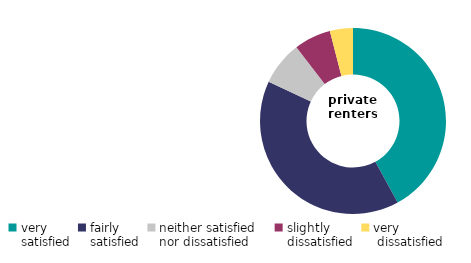
| Category | private renters |
|---|---|
| very 
satisfied | 42.033 |
| fairly
satisfied | 39.887 |
| neither satisfied 
nor dissatisfied | 7.673 |
| slightly 
dissatisfied | 6.404 |
| very
 dissatisfied | 4.003 |